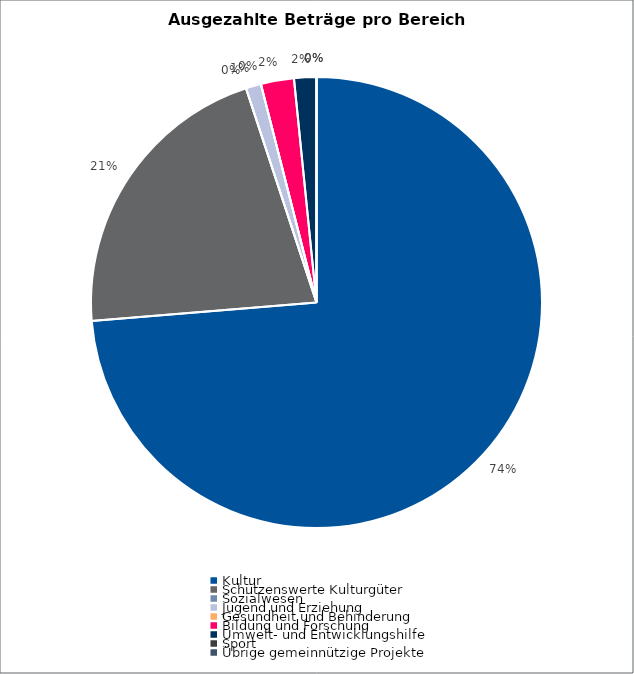
| Category | Series 0 |
|---|---|
| Kultur | 8670237 |
| Schützenswerte Kulturgüter | 2500000 |
| Sozialwesen | 0 |
| Jugend und Erziehung | 128030 |
| Gesundheit und Behinderung | 0 |
| Bildung und Forschung | 278500 |
| Umwelt- und Entwicklungshilfe | 187000 |
| Sport | 1650 |
| Übrige gemeinnützige Projekte | 0 |